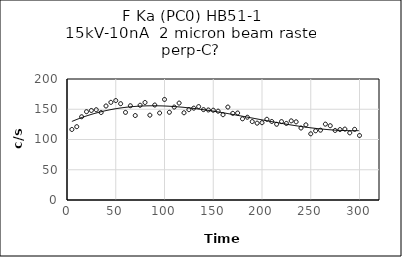
| Category | Series 0 |
|---|---|
| 5.0 | 116.6 |
| 10.0 | 121.2 |
| 15.0 | 137.6 |
| 20.0 | 146 |
| 25.0 | 148 |
| 30.0 | 149.2 |
| 35.0 | 144.6 |
| 40.0 | 155.4 |
| 45.0 | 161.4 |
| 50.0 | 164.4 |
| 55.0 | 159.2 |
| 60.0 | 144.8 |
| 65.0 | 155.8 |
| 70.0 | 139.6 |
| 75.0 | 156.6 |
| 80.0 | 161.2 |
| 85.0 | 140.2 |
| 90.0 | 157 |
| 95.0 | 143.8 |
| 100.0 | 166.2 |
| 105.0 | 145 |
| 110.0 | 153.6 |
| 115.0 | 160.2 |
| 120.0 | 144.2 |
| 125.0 | 149.4 |
| 130.0 | 151.8 |
| 135.0 | 154.4 |
| 140.0 | 149.4 |
| 145.0 | 148.8 |
| 150.0 | 148.4 |
| 155.0 | 146.8 |
| 160.0 | 141 |
| 165.0 | 153.6 |
| 170.0 | 143.2 |
| 175.0 | 143.8 |
| 180.0 | 134.2 |
| 185.0 | 136.8 |
| 190.0 | 129.6 |
| 195.0 | 127 |
| 200.0 | 127.8 |
| 205.0 | 133.4 |
| 210.0 | 129.8 |
| 215.0 | 125.2 |
| 220.0 | 129.6 |
| 225.0 | 126.6 |
| 230.0 | 130.8 |
| 235.0 | 129.2 |
| 240.0 | 119 |
| 245.0 | 124.2 |
| 250.0 | 109.4 |
| 255.0 | 114.4 |
| 260.0 | 115.4 |
| 265.0 | 125.4 |
| 270.0 | 122.8 |
| 275.0 | 115 |
| 280.0 | 116.4 |
| 285.0 | 117.2 |
| 290.0 | 111 |
| 295.0 | 116.8 |
| 300.0 | 106.6 |